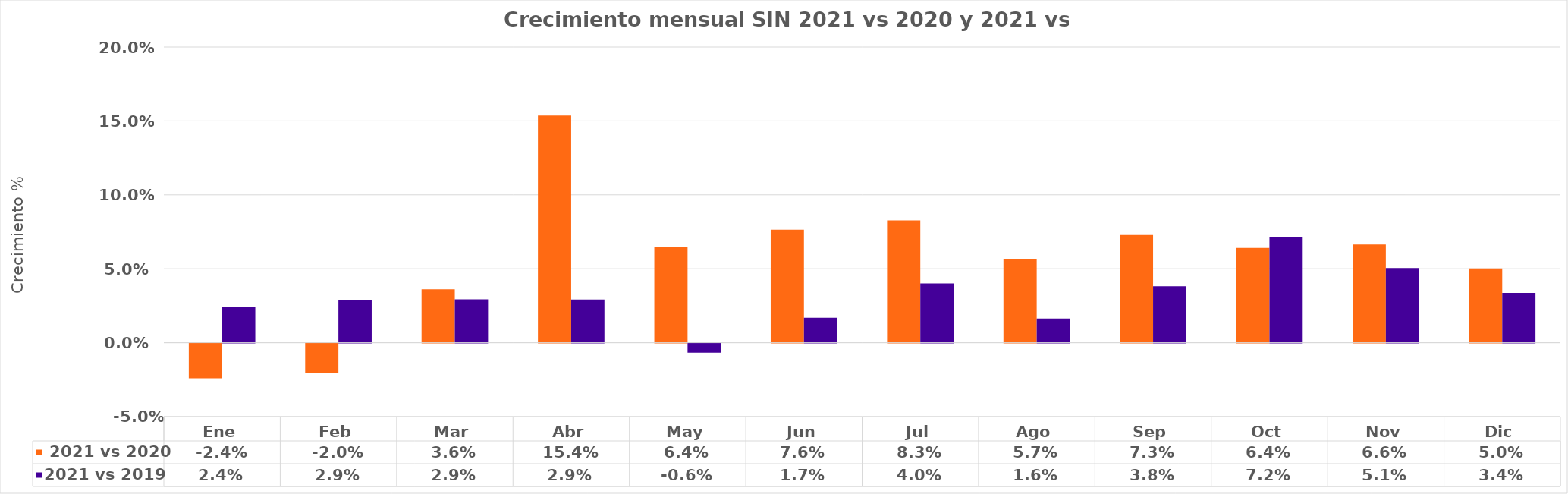
| Category |  2021 vs 2020 | 2021 vs 2019 |
|---|---|---|
| Ene | -0.024 | 0.024 |
| Feb | -0.02 | 0.029 |
| Mar | 0.036 | 0.029 |
| Abr | 0.154 | 0.029 |
| May | 0.064 | -0.006 |
| Jun | 0.076 | 0.017 |
| Jul | 0.083 | 0.04 |
| Ago | 0.057 | 0.016 |
| Sep | 0.073 | 0.038 |
| Oct | 0.064 | 0.072 |
| Nov | 0.066 | 0.051 |
| Dic | 0.05 | 0.034 |